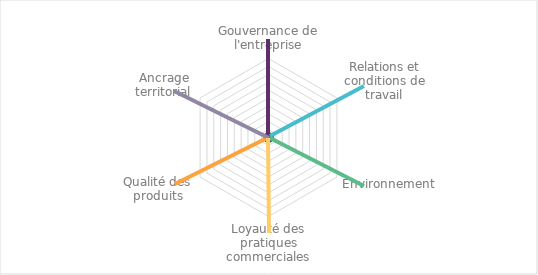
| Category | Series 0 |
|---|---|
| Gouvernance de l'entreprise | 0 |
| Relations et conditions de travail | 0 |
| Environnement | 0 |
| Loyauté des pratiques commerciales | 0 |
| Qualité des produits | 0 |
| Ancrage territorial | 0 |